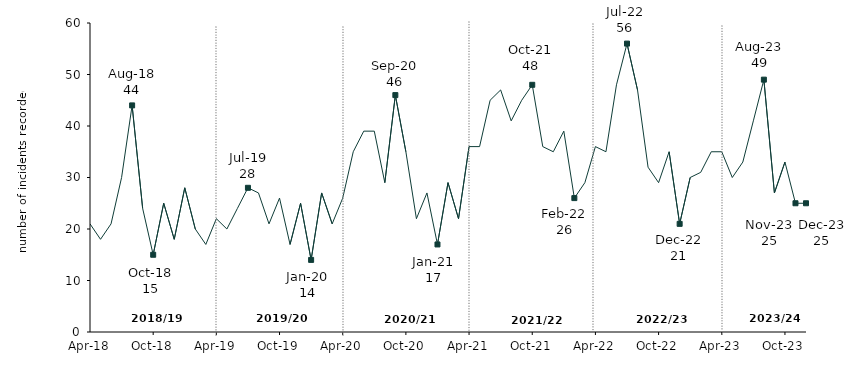
| Category | Series 0 |
|---|---|
| 2018-04-01 | 21 |
| 2018-05-01 | 18 |
| 2018-06-01 | 21 |
| 2018-07-01 | 30 |
| 2018-08-01 | 44 |
| 2018-09-01 | 24 |
| 2018-10-01 | 15 |
| 2018-11-01 | 25 |
| 2018-12-01 | 18 |
| 2019-01-01 | 28 |
| 2019-02-01 | 20 |
| 2019-03-01 | 17 |
| 2019-04-01 | 22 |
| 2019-05-01 | 20 |
| 2019-06-01 | 24 |
| 2019-07-01 | 28 |
| 2019-08-01 | 27 |
| 2019-09-01 | 21 |
| 2019-10-01 | 26 |
| 2019-11-01 | 17 |
| 2019-12-01 | 25 |
| 2020-01-01 | 14 |
| 2020-02-01 | 27 |
| 2020-03-01 | 21 |
| 2020-04-01 | 26 |
| 2020-05-01 | 35 |
| 2020-06-01 | 39 |
| 2020-07-01 | 39 |
| 2020-08-01 | 29 |
| 2020-09-01 | 46 |
| 2020-10-01 | 35 |
| 2020-11-01 | 22 |
| 2020-12-01 | 27 |
| 2021-01-01 | 17 |
| 2021-02-01 | 29 |
| 2021-03-01 | 22 |
| 2021-04-01 | 36 |
| 2021-05-01 | 36 |
| 2021-06-01 | 45 |
| 2021-07-01 | 47 |
| 2021-08-01 | 41 |
| 2021-09-01 | 45 |
| 2021-10-01 | 48 |
| 2021-11-01 | 36 |
| 2021-12-01 | 35 |
| 2022-01-01 | 39 |
| 2022-02-01 | 26 |
| 2022-03-01 | 29 |
| 2022-04-01 | 36 |
| 2022-05-01 | 35 |
| 2022-06-01 | 48 |
| 2022-07-01 | 56 |
| 2022-08-01 | 47 |
| 2022-09-01 | 32 |
| 2022-10-01 | 29 |
| 2022-11-01 | 35 |
| 2022-12-01 | 21 |
| 2023-01-01 | 30 |
| 2023-02-01 | 31 |
| 2023-03-01 | 35 |
| 2023-04-01 | 35 |
| 2023-05-01 | 30 |
| 2023-06-01 | 33 |
| 2023-07-01 | 41 |
| 2023-08-01 | 49 |
| 2023-09-01 | 27 |
| 2023-10-01 | 33 |
| 2023-11-01 | 25 |
| 2023-12-01 | 25 |